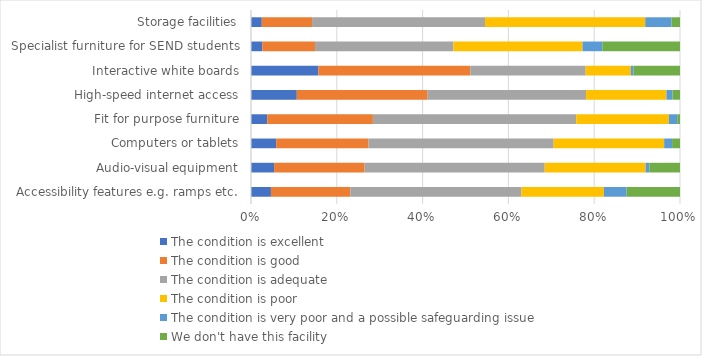
| Category | The condition is excellent | The condition is good | The condition is adequate | The condition is poor | The condition is very poor and a possible safeguarding issue | We don't have this facility |
|---|---|---|---|---|---|---|
| Accessibility features e.g. ramps etc. | 0.046 | 0.185 | 0.399 | 0.192 | 0.053 | 0.124 |
| Audio-visual equipment | 0.054 | 0.211 | 0.42 | 0.235 | 0.009 | 0.071 |
| Computers or tablets | 0.059 | 0.215 | 0.432 | 0.258 | 0.018 | 0.018 |
| Fit for purpose furniture | 0.038 | 0.246 | 0.474 | 0.216 | 0.02 | 0.007 |
| High-speed internet access | 0.107 | 0.305 | 0.369 | 0.187 | 0.014 | 0.017 |
| Interactive white boards | 0.157 | 0.354 | 0.269 | 0.105 | 0.007 | 0.108 |
| Specialist furniture for SEND students | 0.026 | 0.123 | 0.323 | 0.301 | 0.046 | 0.181 |
| Storage facilities | 0.025 | 0.117 | 0.403 | 0.373 | 0.061 | 0.02 |